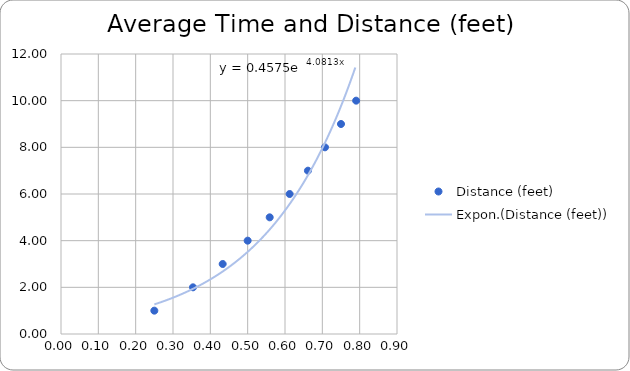
| Category | Distance (feet) |
|---|---|
| 0.25 | 1 |
| 0.3535533905932738 | 2 |
| 0.4330127018922193 | 3 |
| 0.5 | 4 |
| 0.5590169943749475 | 5 |
| 0.6123724356957945 | 6 |
| 0.6614378277661477 | 7 |
| 0.7071067811865476 | 8 |
| 0.75 | 9 |
| 0.7905694150420949 | 10 |